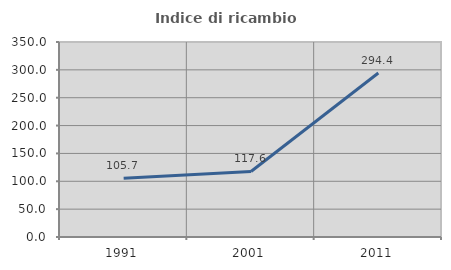
| Category | Indice di ricambio occupazionale  |
|---|---|
| 1991.0 | 105.66 |
| 2001.0 | 117.568 |
| 2011.0 | 294.406 |